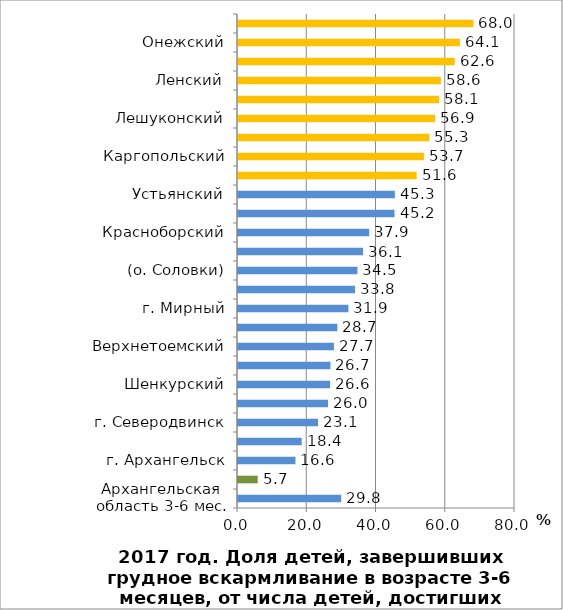
| Category | Series 0 |
|---|---|
| Архангельская область 3-6 мес. | 29.8 |
| Вилегодский | 5.7 |
| г. Архангельск | 16.6 |
| Мезенский | 18.4 |
| г. Северодвинск | 23.1 |
| г. Котлас | 26 |
| Шенкурский | 26.6 |
| г. Коряжма | 26.7 |
| Верхнетоемский | 27.7 |
| г. Новодвинск | 28.7 |
| г. Мирный | 31.9 |
| Виноградовский | 33.8 |
| (о. Соловки) | 34.5 |
| Холмогорский | 36.1 |
| Красноборский | 37.9 |
| Вельский | 45.2 |
| Устьянский | 45.3 |
| Пинежский | 51.6 |
| Каргопольский | 53.7 |
| Плесецкий | 55.3 |
| Лешуконский | 56.9 |
| Коношский | 58.1 |
| Ленский | 58.6 |
| Приморский | 62.6 |
| Онежский | 64.1 |
| Няндомский | 68 |